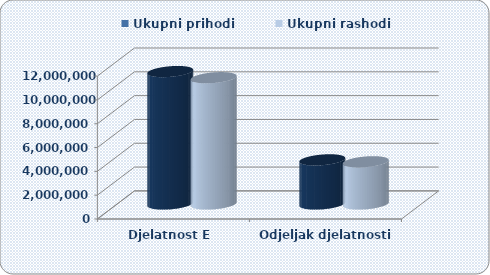
| Category | Ukupni prihodi  | Ukupni rashodi  |
|---|---|---|
| Djelatnost E  | 11122849.891 | 10606520.803 |
| Odjeljak djelatnosti 36 | 3707398.723 | 3545520.991 |